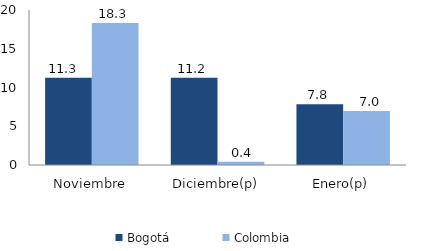
| Category | Bogotá | Colombia |
|---|---|---|
| Noviembre | 11.256 | 18.33 |
| Diciembre(p) | 11.244 | 0.433 |
| Enero(p) | 7.847 | 6.968 |